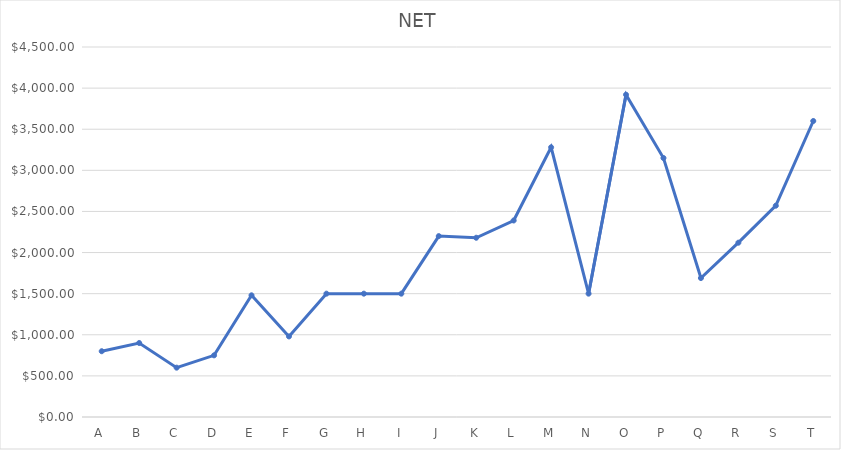
| Category | Series 0 |
|---|---|
| A | 800 |
| B | 900 |
| C | 600 |
| D | 750 |
| E | 1480 |
| F | 980 |
| G | 1500 |
| H | 1500 |
| I | 1500 |
| J | 2200 |
| K | 2180 |
| L | 2390 |
| M | 3280 |
| N | 1500 |
| O | 3920 |
| P | 3150 |
| Q | 1690 |
| R | 2120 |
| S | 2570 |
| T | 3600 |